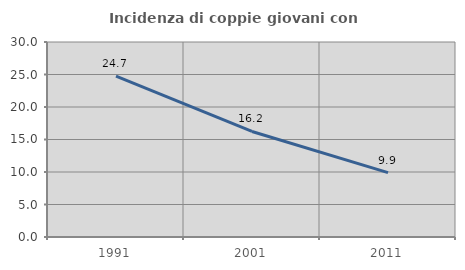
| Category | Incidenza di coppie giovani con figli |
|---|---|
| 1991.0 | 24.735 |
| 2001.0 | 16.235 |
| 2011.0 | 9.908 |